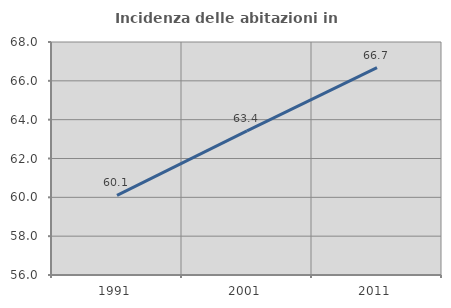
| Category | Incidenza delle abitazioni in proprietà  |
|---|---|
| 1991.0 | 60.104 |
| 2001.0 | 63.419 |
| 2011.0 | 66.681 |